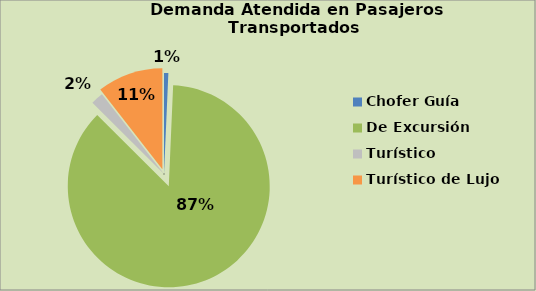
| Category | Series 0 |
|---|---|
| Chofer Guía | 0.69 |
| De Excursión | 86.772 |
| Turístico  | 2.006 |
| Turístico de Lujo  | 10.532 |